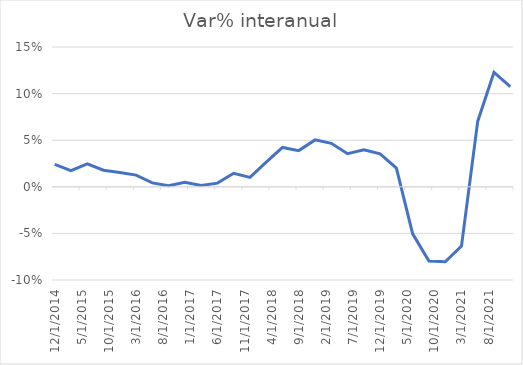
| Category | Series 0 |
|---|---|
| 12/20/14 | 0.024 |
| 3/20/15 | 0.017 |
| 6/18/15 | 0.025 |
| 9/16/15 | 0.018 |
| 12/15/15 | 0.015 |
| 3/14/16 | 0.013 |
| 6/12/16 | 0.004 |
| 9/10/16 | 0.001 |
| 12/9/16 | 0.005 |
| 3/9/17 | 0.001 |
| 6/7/17 | 0.004 |
| 9/5/17 | 0.014 |
| 12/4/17 | 0.01 |
| 3/30/18 | 0.026 |
| 6/28/18 | 0.042 |
| 9/26/18 | 0.039 |
| 12/25/18 | 0.05 |
| 3/25/19 | 0.047 |
| 6/23/19 | 0.035 |
| 9/21/19 | 0.04 |
| 12/20/19 | 0.035 |
| 3/19/20 | 0.02 |
| 6/17/20 | -0.05 |
| 9/15/20 | -0.08 |
| 12/14/20 | -0.08 |
| 3/14/21 | -0.064 |
| 6/12/21 | 0.07 |
| 9/10/21 | 0.123 |
| 12/9/21 | 0.108 |